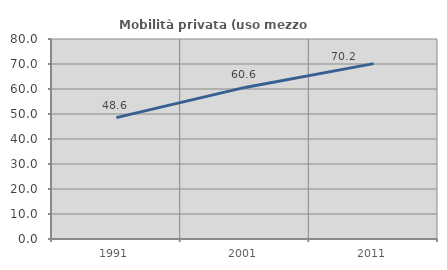
| Category | Mobilità privata (uso mezzo privato) |
|---|---|
| 1991.0 | 48.561 |
| 2001.0 | 60.635 |
| 2011.0 | 70.154 |